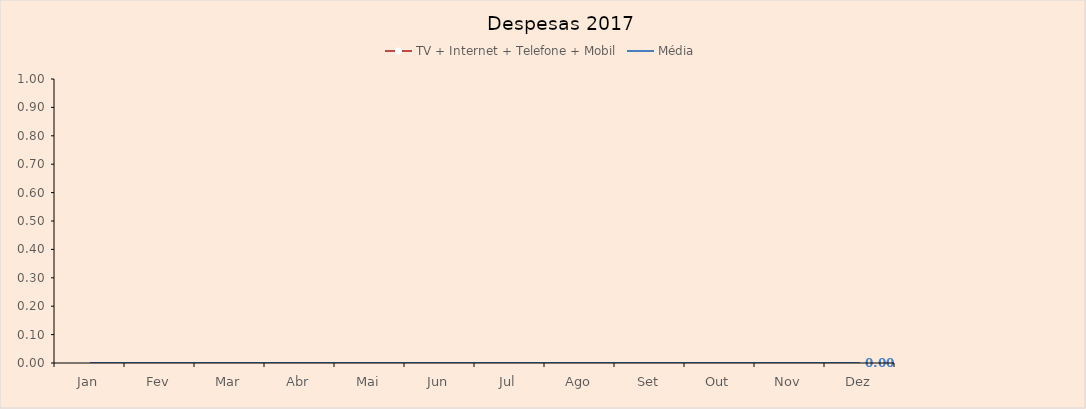
| Category | TV + Internet + Telefone + Mobil | Média |
|---|---|---|
| Jan |  | 0 |
| Fev |  | 0 |
| Mar |  | 0 |
| Abr |  | 0 |
| Mai |  | 0 |
| Jun |  | 0 |
| Jul |  | 0 |
| Ago |  | 0 |
| Set |  | 0 |
| Out |  | 0 |
| Nov |  | 0 |
| Dez |  | 0 |